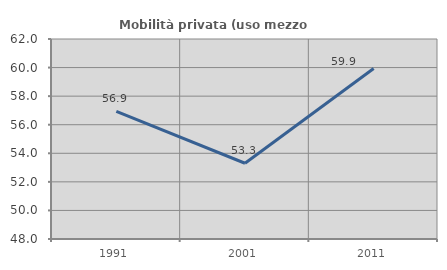
| Category | Mobilità privata (uso mezzo privato) |
|---|---|
| 1991.0 | 56.931 |
| 2001.0 | 53.302 |
| 2011.0 | 59.93 |